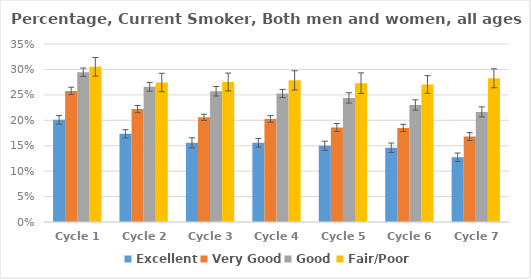
| Category | Excellent | Very Good | Good | Fair/Poor |
|---|---|---|---|---|
| Cycle 1 | 0.201 | 0.258 | 0.294 | 0.305 |
| Cycle 2 | 0.173 | 0.222 | 0.266 | 0.274 |
| Cycle 3 | 0.156 | 0.206 | 0.257 | 0.275 |
| Cycle 4 | 0.156 | 0.203 | 0.253 | 0.279 |
| Cycle 5 | 0.15 | 0.186 | 0.244 | 0.273 |
| Cycle 6 | 0.146 | 0.185 | 0.23 | 0.27 |
| Cycle 7 | 0.127 | 0.168 | 0.216 | 0.283 |